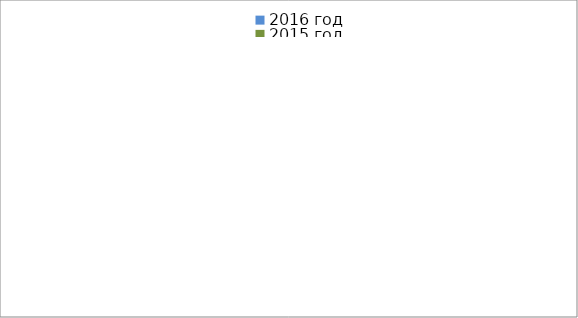
| Category | 2016 год | 2015 год |
|---|---|---|
|  - поджог | 22 | 11 |
|  - неосторожное обращение с огнём | 17 | 28 |
|  - НПТЭ электрооборудования | 3 | 7 |
|  - НПУ и Э печей | 23 | 24 |
|  - НПУ и Э транспортных средств | 11 | 30 |
|   -Шалость с огнем детей | 5 | 2 |
|  -НППБ при эксплуатации эл.приборов | 5 | 9 |
|  - курение | 6 | 11 |
| - прочие | 63 | 51 |
| - не установленные причины | 12 | 6 |